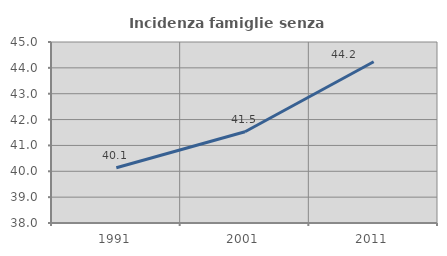
| Category | Incidenza famiglie senza nuclei |
|---|---|
| 1991.0 | 40.137 |
| 2001.0 | 41.529 |
| 2011.0 | 44.236 |